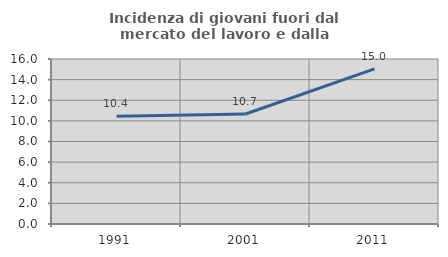
| Category | Incidenza di giovani fuori dal mercato del lavoro e dalla formazione  |
|---|---|
| 1991.0 | 10.44 |
| 2001.0 | 10.667 |
| 2011.0 | 15.038 |